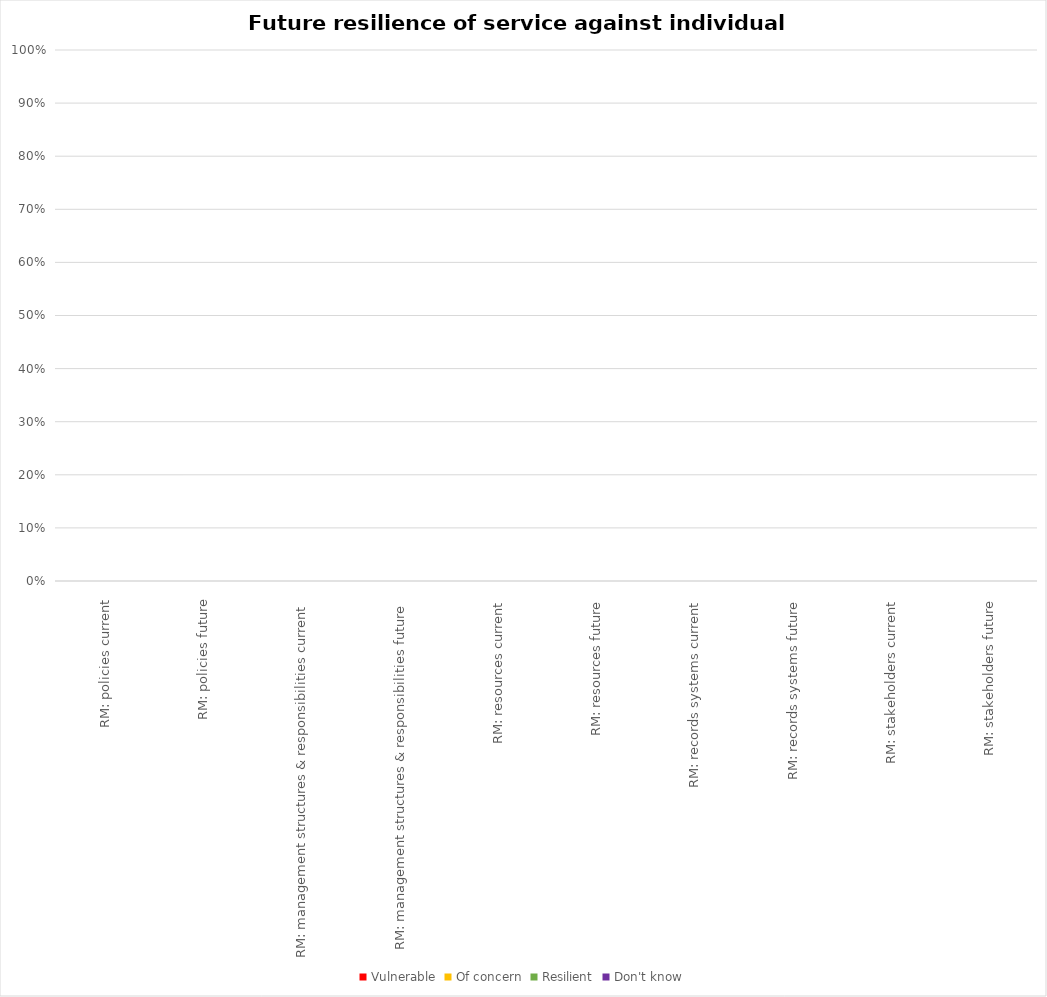
| Category | Vulnerable | Of concern | Resilient | Don't know |
|---|---|---|---|---|
| RM: policies current | 0 | 0 | 0 | 0 |
| RM: policies future | 0 | 0 | 0 | 0 |
| RM: management structures & responsibilities current | 0 | 0 | 0 | 0 |
| RM: management structures & responsibilities future | 0 | 0 | 0 | 0 |
| RM: resources current | 0 | 0 | 0 | 0 |
| RM: resources future | 0 | 0 | 0 | 0 |
| RM: records systems current | 0 | 0 | 0 | 0 |
| RM: records systems future | 0 | 0 | 0 | 0 |
| RM: stakeholders current | 0 | 0 | 0 | 0 |
| RM: stakeholders future | 0 | 0 | 0 | 0 |